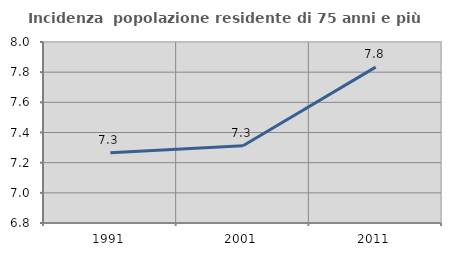
| Category | Incidenza  popolazione residente di 75 anni e più |
|---|---|
| 1991.0 | 7.266 |
| 2001.0 | 7.312 |
| 2011.0 | 7.834 |